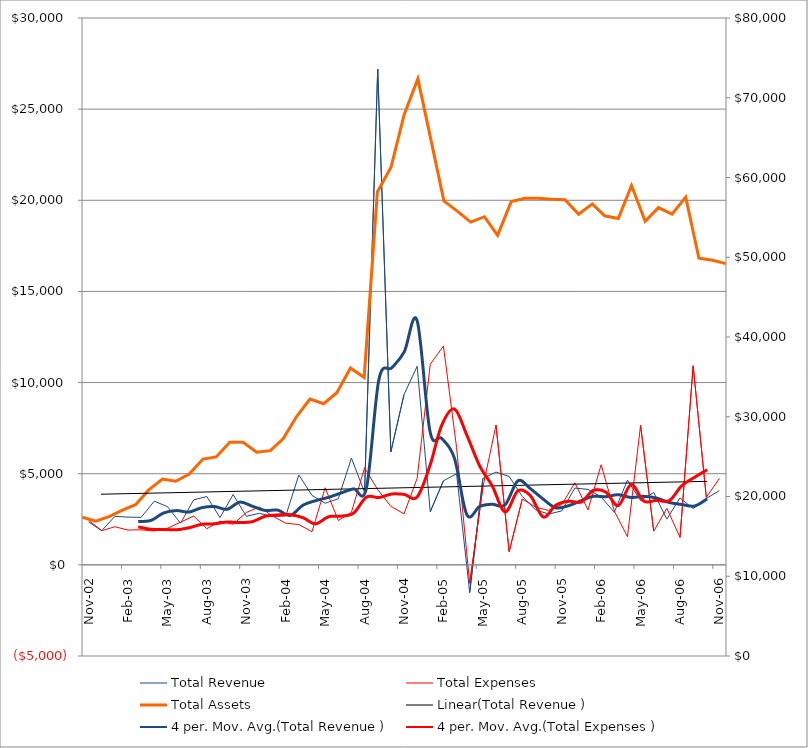
| Category | Total Revenue  | Total Expenses  |
|---|---|---|
| 2002-11-30 | 2353.94 | 2452.54 |
| 2002-12-31 | 1875.09 | 1875.94 |
| 2003-01-31 | 2660.02 | 2089.71 |
| 2003-02-28 | 2620 | 1910.04 |
| 2003-03-31 | 2604.3 | 1923.33 |
| 2003-04-30 | 3494.25 | 1860.73 |
| 2003-05-31 | 3196.21 | 2004.84 |
| 2003-06-30 | 2284.92 | 2343.59 |
| 2003-07-31 | 3568.7 | 2679.15 |
| 2003-08-31 | 3748.22 | 1985.02 |
| 2003-09-30 | 2590.61 | 2392.01 |
| 2003-10-31 | 3859.7 | 2228.27 |
| 2003-11-30 | 2665.2 | 2873.12 |
| 2003-12-31 | 2825.79 | 3175.05 |
| 2004-01-31 | 2650.34 | 2679.6 |
| 2004-02-29 | 2678.88 | 2284.3 |
| 2004-03-31 | 4932.51 | 2212.33 |
| 2004-04-30 | 3809.67 | 1817.44 |
| 2004-05-31 | 3379.99 | 4227.96 |
| 2004-06-30 | 3625.12 | 2433.96 |
| 2004-07-31 | 5857.47 | 2883.05 |
| 2004-08-31 | 3982.64 | 5326.91 |
| 2004-09-30 | 27198.67 | 4122.99 |
| 2004-10-31 | 6197.88 | 3211.74 |
| 2004-11-30 | 9338.58 | 2797.41 |
| 2004-12-31 | 10892.81 | 4747.72 |
| 2005-01-31 | 2917.08 | 11004.17 |
| 2005-02-28 | 4610.03 | 12006.52 |
| 2005-03-31 | 4996.83 | 6440.08 |
| 2005-04-30 | -1520.78 | -1010.41 |
| 2005-05-31 | 4743.08 | 4247.81 |
| 2005-06-30 | 5089.23 | 7668.19 |
| 2005-07-31 | 4849.84 | 727.42 |
| 2005-08-31 | 3758.56 | 3614.78 |
| 2005-09-30 | 3021.58 | 3174.23 |
| 2005-10-31 | 2789.7 | 2986.63 |
| 2005-11-30 | 2954.66 | 3298.62 |
| 2005-12-31 | 4212.66 | 4502.12 |
| 2006-01-31 | 4141.62 | 3011.89 |
| 2006-02-28 | 3721.02 | 5492.64 |
| 2006-03-31 | 2883.96 | 2953.53 |
| 2006-04-30 | 4651.02 | 1546.16 |
| 2006-05-31 | 3529.15 | 7652.01 |
| 2006-06-30 | 3970.3 | 1849.5 |
| 2006-07-31 | 2510.84 | 3102.44 |
| 2006-08-31 | 3671.78 | 1504.1 |
| 2006-09-30 | 3090.22 | 10920.01 |
| 2006-10-31 | 3641.89 | 3704.4 |
| 2006-11-30 | 4072.88 | 4742.85 |